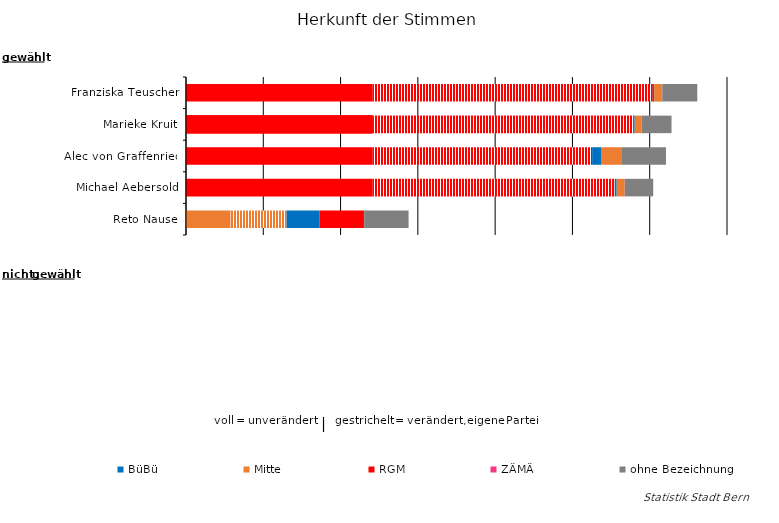
| Category | unverändert | verändert, eigene Liste | BüBü | Mitte | RGM | ZÄMÄ | ohne Bezeichnung |
|---|---|---|---|---|---|---|---|
| Franziska Teuscher | 12052 | 18148 | 89 | 496 | 0 | 26 | 2266 |
| Marieke Kruit | 12052 | 16872 | 103 | 441 | 0 | 15 | 1928 |
| Alec von Graffenried | 12052 | 14222 | 575 | 1300 | 0 | 13 | 2891 |
| Michael Aebersold | 12052 | 15682 | 128 | 513 | 0 | 10 | 1842 |
| Reto Nause | 2891 | 3618 | 2126 | 0 | 2878 | 12 | 2875 |